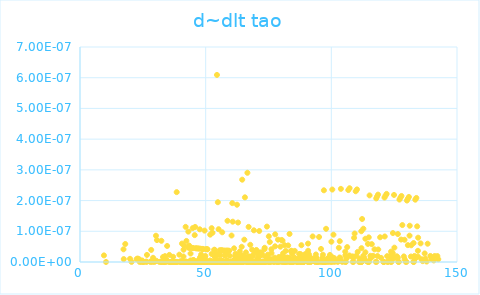
| Category | dlt tao |
|---|---|
| 9.53178891919036 | 0 |
| 10.3467386165883 | 0 |
| 17.3105459186012 | 0 |
| 17.4199598162568 | 0 |
| 18.0070819401701 | 0 |
| 19.9036428826484 | 0 |
| 20.5147507905897 | 0 |
| 22.5134404301075 | 0 |
| 22.9053487203317 | 0 |
| 23.49797863647 | 0 |
| 23.7351005896331 | 0 |
| 24.3033948245919 | 0 |
| 24.7437870989871 | 0 |
| 24.8083655245564 | 0 |
| 25.218148227021 | 0 |
| 25.3012845523701 | 0 |
| 26.3961171387005 | 0 |
| 26.4434301859649 | 0 |
| 26.6449807656151 | 0 |
| 27.9384144145655 | 0 |
| 28.2144466541522 | 0 |
| 28.3311665838172 | 0 |
| 28.8106751048982 | 0 |
| 29.0732695099812 | 0 |
| 29.6623498731978 | 0 |
| 30.221763681162 | 0 |
| 30.4114287727492 | 0 |
| 30.6260510023738 | 0 |
| 31.5777611619317 | 0 |
| 32.2405800195964 | 0 |
| 32.3829430410517 | 0 |
| 32.3937493970673 | 0 |
| 32.6612155315751 | 0 |
| 33.034148997666 | 0 |
| 33.3474886610671 | 0 |
| 33.4731982338109 | 0 |
| 33.651968738842 | 0 |
| 33.8031803237506 | 0 |
| 34.1387609616987 | 0 |
| 34.2834508181426 | 0 |
| 34.4971737972838 | 0 |
| 34.6692226621827 | 0 |
| 35.4493300359824 | 0 |
| 35.5324499577499 | 0 |
| 35.8574260091268 | 0 |
| 35.8699735154628 | 0 |
| 36.4986986069367 | 0 |
| 36.8232942578472 | 0 |
| 36.907384085031 | 0 |
| 37.057455390245 | 0 |
| 37.4173088289364 | 0 |
| 38.0099329123323 | 0 |
| 38.1713898096467 | 0 |
| 38.3830040512725 | 0 |
| 38.4727825871745 | 0 |
| 38.8259578117527 | 0 |
| 39.5291664470679 | 0 |
| 39.8516624496394 | 0 |
| 40.0731206671005 | 0 |
| 40.1067949355218 | 0 |
| 40.4197352786977 | 0 |
| 40.575300368574 | 0 |
| 40.5814612846802 | 0 |
| 40.9579662581042 | 0 |
| 40.976273622671 | 0 |
| 41.0713403725761 | 0 |
| 41.1807600706932 | 0 |
| 41.208676270902 | 0 |
| 41.2898898036796 | 0 |
| 41.4373623677956 | 0 |
| 41.8348538900281 | 0 |
| 41.9744565182207 | 0 |
| 42.0411108321367 | 0 |
| 42.0696446383851 | 0 |
| 42.3291270876214 | 0 |
| 42.4682822821927 | 0 |
| 42.5846803439923 | 0 |
| 43.0018022878112 | 0 |
| 43.0540938819992 | 0 |
| 43.0912404091597 | 0 |
| 43.1051621038595 | 0 |
| 43.2140602119264 | 0 |
| 43.4103098353375 | 0 |
| 43.475912871382 | 0 |
| 43.5287835805229 | 0 |
| 43.6308950171779 | 0 |
| 43.7281945659777 | 0 |
| 43.9676585685433 | 0 |
| 43.9869867119811 | 0 |
| 44.0256175425172 | 0 |
| 44.0619450319661 | 0 |
| 44.0619450319661 | 0 |
| 44.2758963771486 | 0 |
| 44.4393406791775 | 0 |
| 44.654842962438 | 0 |
| 44.6671579574971 | 0 |
| 44.6671579574972 | 0 |
| 44.8157896282103 | 0 |
| 44.8414428849028 | 0 |
| 45.1115838782014 | 0 |
| 45.1226661446329 | 0 |
| 45.1226661446329 | 0 |
| 45.3382289023292 | 0 |
| 45.5955589942705 | 0 |
| 45.6437838045883 | 0 |
| 45.7269614122784 | 0 |
| 45.8045303436243 | 0 |
| 45.9396887233686 | 0 |
| 45.9494831309341 | 0 |
| 46.0701096156716 | 0 |
| 46.1275947779634 | 0 |
| 46.2866611455179 | 0 |
| 46.3837794924045 | 0 |
| 46.4139526435748 | 0 |
| 46.5430445931505 | 0 |
| 46.9335168083535 | 0 |
| 47.1344353949424 | 0 |
| 47.1662485258262 | 0 |
| 47.3123134078223 | 0 |
| 47.3123134078223 | 0 |
| 47.3988923921224 | 0 |
| 47.5568607037933 | 0 |
| 47.6545380840062 | 0 |
| 47.6660780849442 | 0 |
| 47.7425910482454 | 0 |
| 47.9202984130942 | 0 |
| 48.1897810744145 | 0 |
| 48.2022302388593 | 0 |
| 48.2354123025812 | 0 |
| 48.2675356735767 | 0 |
| 48.6688298605997 | 0 |
| 48.8257616428049 | 0 |
| 48.8779602684073 | 0 |
| 48.8851204355681 | 0 |
| 48.9893355741839 | 0 |
| 49.047476999332 | 0 |
| 49.1330336942469 | 0 |
| 49.2702242738959 | 0 |
| 49.5010605946984 | 0 |
| 49.5737329641414 | 0 |
| 49.5939008346793 | 0 |
| 49.6281674052146 | 0 |
| 49.6785164834861 | 0 |
| 49.8202268160232 | 0 |
| 49.8743922268733 | 0 |
| 49.9975499399721 | 0 |
| 50.0095490881492 | 0 |
| 50.2618642710356 | 0 |
| 50.5109394092013 | 0 |
| 50.5475518695021 | 0 |
| 50.580183866807 | 0 |
| 50.7075438174637 | 0 |
| 50.7509113218669 | 0 |
| 51.546629375741 | 0 |
| 51.7238339646241 | 0 |
| 51.7962836504705 | 0 |
| 51.8368112445201 | 0 |
| 51.9957209777882 | 0 |
| 52.2403579620201 | 0 |
| 52.3827738860782 | 0 |
| 52.3885006466114 | 0 |
| 52.423801846108 | 0 |
| 52.5381290112239 | 0 |
| 52.5409840029667 | 0 |
| 52.7195883898955 | 0 |
| 52.8985349513576 | 0 |
| 52.8994801486744 | 0 |
| 53.0184401882968 | 0 |
| 53.1794603206915 | 0 |
| 53.3727926944056 | 0 |
| 53.5999533581887 | 0 |
| 53.6819802168288 | 0 |
| 53.7545812001173 | 0 |
| 53.7545812001173 | 0 |
| 53.7741108713105 | 0 |
| 54.0162475557123 | 0 |
| 54.0486355054408 | 0 |
| 54.0939460568371 | 0 |
| 54.4780230918854 | 0 |
| 54.4963760263011 | 0 |
| 54.4963760263011 | 0 |
| 54.6841384681152 | 0 |
| 54.7608893280597 | 0 |
| 54.7937496435497 | 0 |
| 54.8502962617341 | 0 |
| 55.1475747426848 | 0 |
| 55.4576865727376 | 0 |
| 55.6296234033631 | 0 |
| 55.7409633931815 | 0 |
| 55.7436543473784 | 0 |
| 55.7857956831307 | 0 |
| 55.7992383460563 | 0 |
| 55.8968245967515 | 0 |
| 55.8968245967515 | 0 |
| 55.9719125990885 | 0 |
| 55.9719125990885 | 0 |
| 56.249044436328 | 0 |
| 56.4646349496745 | 0 |
| 56.5080082820126 | 0 |
| 56.5787504280538 | 0 |
| 56.5787504280538 | 0 |
| 56.6246854295898 | 0 |
| 56.6846981115715 | 0 |
| 56.6846981115715 | 0 |
| 56.936411899592 | 0 |
| 57.1065232701134 | 0 |
| 57.4896077565328 | 0 |
| 57.6736941768082 | 0 |
| 57.7551296423097 | 0 |
| 57.8718843653807 | 0 |
| 57.9357834157785 | 0 |
| 57.9444130179951 | 0 |
| 57.9858172314576 | 0 |
| 58.1820848715479 | 0 |
| 58.2619515636062 | 0 |
| 58.3854005724034 | 0 |
| 58.4957690777718 | 0 |
| 58.5487403792772 | 0 |
| 58.6212845304502 | 0 |
| 58.6741425161033 | 0 |
| 58.6894794660849 | 0 |
| 58.6894794660849 | 0 |
| 58.7099225003747 | 0 |
| 58.7286556971978 | 0 |
| 59.1375937961632 | 0 |
| 59.3426912096174 | 0 |
| 59.5470822123133 | 0 |
| 59.7089189317643 | 0 |
| 59.9320865647109 | 0 |
| 60.1469450595789 | 0 |
| 60.1569198014659 | 0 |
| 60.3013681436831 | 0 |
| 60.5892317165353 | 0 |
| 60.7762700402057 | 0 |
| 60.7762700402057 | 0 |
| 60.8412277982619 | 0 |
| 60.8749127309436 | 0 |
| 60.9397653425085 | 0 |
| 61.2074750336918 | 0 |
| 61.2687114276121 | 0 |
| 61.3054239035993 | 0 |
| 61.3078706203372 | 0 |
| 61.32010273964 | 0 |
| 61.7175420767872 | 0 |
| 61.7507489833119 | 0 |
| 61.8340925380166 | 0 |
| 61.8947089822709 | 0 |
| 62.1365834271567 | 0 |
| 62.3679003975603 | 0 |
| 62.3751152303545 | 0 |
| 62.4207898059613 | 0 |
| 62.4207898059613 | 0 |
| 62.4640296490708 | 0 |
| 62.8892280124347 | 0 |
| 62.9329405001864 | 0 |
| 63.0139270320459 | 0 |
| 63.1542160112846 | 0 |
| 63.5700794399378 | 0 |
| 63.5897397384201 | 0 |
| 63.8204904399833 | 0 |
| 63.8980046636826 | 0 |
| 64.07148351646 | 0 |
| 64.1042510290854 | 0 |
| 64.1650605859607 | 0 |
| 64.2468287155094 | 0 |
| 64.3401507614025 | 0 |
| 64.3401507614025 | 0 |
| 64.3494755223382 | 0 |
| 64.391420235929 | 0 |
| 64.5325886665025 | 0 |
| 64.5728658183916 | 0 |
| 64.5821569785339 | 0 |
| 64.6935468188288 | 0 |
| 64.751486469424 | 0 |
| 64.7538029771225 | 0 |
| 64.7538029771225 | 0 |
| 64.8810835297932 | 0 |
| 64.9796506608031 | 0 |
| 64.9981153572932 | 0 |
| 65.0995775715941 | 0 |
| 65.1141689649803 | 0 |
| 65.3785515287698 | 0 |
| 65.4679692674212 | 0 |
| 65.6182520340187 | 0 |
| 66.0223825683381 | 0 |
| 66.2763532491039 | 0 |
| 66.3396939998972 | 0 |
| 66.4112565759751 | 0 |
| 66.5428809114844 | 0 |
| 66.6059682010554 | 0 |
| 66.6059682010554 | 0 |
| 66.6194791333586 | 0 |
| 66.8599655997519 | 0 |
| 67.0943738326844 | 0 |
| 67.1390720817618 | 0 |
| 67.139816800465 | 0 |
| 67.3175682864436 | 0 |
| 67.5518689600813 | 0 |
| 67.7469925531754 | 0 |
| 67.8060100581062 | 0 |
| 67.9658370065432 | 0 |
| 68.134829566089 | 0 |
| 68.3743738545371 | 0 |
| 68.5000364963406 | 0 |
| 68.5394411999398 | 0 |
| 68.9278971099511 | 0 |
| 68.9344253620787 | 0 |
| 68.9453044086398 | 0 |
| 69.1184128868712 | 0 |
| 69.1878240733151 | 0 |
| 69.5187384810743 | 0 |
| 69.5733785294347 | 0 |
| 69.5992456855676 | 0 |
| 69.8251745432835 | 0 |
| 70.1637727035826 | 0 |
| 70.4177179408706 | 0 |
| 70.4709514622869 | 0 |
| 70.5028722819149 | 0 |
| 70.7930434435475 | 0 |
| 70.8106983442474 | 0 |
| 71.017990678419 | 0 |
| 71.1502283903573 | 0 |
| 71.3004558190199 | 0 |
| 71.3004558190199 | 0 |
| 71.3039620217559 | 0 |
| 71.3214904499338 | 0 |
| 71.5140196045503 | 0 |
| 71.9955206939987 | 0 |
| 72.0496703670461 | 0 |
| 72.0788110334792 | 0 |
| 72.1820961180818 | 0 |
| 72.6240662590577 | 0 |
| 72.6240662590577 | 0 |
| 72.7932345757489 | 0 |
| 73.0749957235716 | 0 |
| 73.1098830528404 | 0 |
| 73.3999659400466 | 0 |
| 73.481664379626 | 0 |
| 73.6617607717871 | 0 |
| 73.7187560936835 | 0 |
| 73.7431691751853 | 0 |
| 73.9435933668361 | 0 |
| 74.3744243675203 | 0 |
| 74.7492809329963 | 0 |
| 74.7633265712542 | 0 |
| 75.0076996047739 | 0 |
| 75.0090327893915 | 0 |
| 75.1235981566379 | 0 |
| 75.4105761813288 | 0 |
| 75.470225917245 | 0 |
| 75.5172496850885 | 0 |
| 75.6786297444662 | 0 |
| 75.7156192604934 | 0 |
| 75.7638106222225 | 0 |
| 76.1587486766951 | 0 |
| 76.2060037004959 | 0 |
| 76.9600870581628 | 0 |
| 77.2984799333079 | 0 |
| 77.412886524144 | 0 |
| 77.6154301669455 | 0 |
| 77.6585796934248 | 0 |
| 77.7833851153317 | 0 |
| 77.8951538929092 | 0 |
| 78.3106314621457 | 0 |
| 78.7061306379624 | 0 |
| 78.7366179106012 | 0 |
| 78.7747104088616 | 0 |
| 79.0199658314277 | 0 |
| 79.198200737138 | 0 |
| 79.2095638164988 | 0 |
| 79.7336503616886 | 0 |
| 79.9221809011741 | 0 |
| 80.1002808983839 | 0 |
| 80.2256505115415 | 0 |
| 80.345223877963 | 0 |
| 80.5701867938756 | 0 |
| 80.789572346931 | 0 |
| 80.9682345120604 | 0 |
| 81.1643702618335 | 0 |
| 81.2401070900328 | 0 |
| 81.2585687789294 | 0 |
| 81.4171664945422 | 0 |
| 81.5073923027844 | 0 |
| 81.5202735520435 | 0 |
| 81.7114129115389 | 0 |
| 81.8337033257081 | 0 |
| 82.0484917594468 | 0 |
| 82.4108912705111 | 0 |
| 82.821826833269 | 0 |
| 82.8290709835623 | 0 |
| 83.1922772858154 | 0 |
| 83.3717877941933 | 0 |
| 83.6489987985511 | 0 |
| 83.8048626274156 | 0 |
| 83.8495974945617 | 0 |
| 83.9526950133228 | 0 |
| 84.0836190943278 | 0 |
| 84.4284016193603 | 0 |
| 84.4947039760481 | 0 |
| 84.5035798058284 | 0 |
| 84.6879861609662 | 0 |
| 84.9514861553346 | 0 |
| 85.277517552987 | 0 |
| 85.4444556422475 | 0 |
| 86.1821037106893 | 0 |
| 86.2325634548806 | 0 |
| 86.3507672229958 | 0 |
| 86.39765621821 | 0 |
| 86.7718560363901 | 0 |
| 86.9635268374047 | 0 |
| 87.209259829447 | 0 |
| 87.4159882401383 | 0 |
| 87.4880277523731 | 0 |
| 87.6661565257654 | 0 |
| 87.7476780319571 | 0 |
| 87.9207313436371 | 0 |
| 88.0911743592966 | 0 |
| 88.4175039231486 | 0 |
| 88.6530033332205 | 0 |
| 88.982329706521 | 0 |
| 89.0160378808224 | 0 |
| 89.0716284795557 | 0 |
| 89.1103529338763 | 0 |
| 89.5396839395807 | 0 |
| 89.6038782642805 | 0 |
| 90.0041943467081 | 0 |
| 90.6457665862008 | 0 |
| 90.7246107734831 | 0 |
| 90.7598754957278 | 0 |
| 90.8919963473132 | 0 |
| 91.0826822178618 | 0 |
| 91.1079305000394 | 0 |
| 91.657814724114 | 0 |
| 91.8098850886984 | 0 |
| 91.821321053446 | 0 |
| 91.8376556756541 | 0 |
| 92.5740514399149 | 0 |
| 93.4486757530571 | 0 |
| 93.5946312562852 | 0 |
| 93.626678890154 | 0 |
| 93.8581642692845 | 0 |
| 94.1140531482945 | 0 |
| 94.3210209868405 | 0 |
| 94.5640259295257 | 0 |
| 95.1170594583327 | 0 |
| 95.2609836186883 | 0 |
| 95.8882422406418 | 0 |
| 96.1106393694267 | 0 |
| 96.4300523695803 | 0 |
| 96.6087728935628 | 0 |
| 96.6470641044 | 0 |
| 96.8398420073061 | 0 |
| 97.0038916745097 | 0 |
| 97.0451183728476 | 0 |
| 97.3327026235273 | 0 |
| 97.5774307921663 | 0 |
| 97.7341035667694 | 0 |
| 97.9038048290259 | 0 |
| 98.2891397866519 | 0 |
| 98.6537125505168 | 0 |
| 98.782867947838 | 0 |
| 99.4482528755533 | 0 |
| 99.5919424451597 | 0 |
| 100.01527383355 | 0 |
| 100.235996528193 | 0 |
| 100.388022193885 | 0 |
| 100.514949136932 | 0 |
| 100.84867376421 | 0 |
| 101.169931303723 | 0 |
| 101.221810890736 | 0 |
| 102.576093706087 | 0 |
| 102.793749809996 | 0 |
| 102.987159393781 | 0 |
| 103.29837849647 | 0 |
| 103.349189643654 | 0 |
| 103.588874885289 | 0 |
| 103.79670033291 | 0 |
| 104.370757398804 | 0 |
| 105.529403485474 | 0 |
| 105.561143419347 | 0 |
| 105.5990293516 | 0 |
| 105.772657147299 | 0 |
| 106.037516945655 | 0 |
| 106.093614322446 | 0 |
| 106.312534538501 | 0 |
| 106.747622924354 | 0 |
| 107.178146093315 | 0 |
| 107.264882417313 | 0 |
| 108.183894365104 | 0 |
| 108.51384704267 | 0 |
| 108.54701746248 | 0 |
| 108.752724103813 | 0 |
| 108.899747474455 | 0 |
| 109.058493479417 | 0 |
| 109.27787973785 | 0 |
| 109.701207832913 | 0 |
| 109.95660507673 | 0 |
| 110.204605166935 | 0 |
| 110.491877529527 | 0 |
| 111.016012358578 | 0 |
| 111.240977162195 | 0 |
| 111.533649630952 | 0 |
| 111.733857894552 | 0 |
| 111.911817963967 | 0 |
| 111.987298386915 | 0 |
| 112.014083935905 | 0 |
| 112.024796362234 | 0 |
| 112.245066706738 | 0 |
| 112.743758142081 | 0 |
| 112.746419011869 | 0 |
| 113.109482361118 | 0 |
| 113.542304891173 | 0 |
| 113.54450669231 | 0 |
| 113.846629286949 | 0 |
| 114.520980610541 | 0 |
| 114.570742338522 | 0 |
| 114.715975347813 | 0 |
| 114.889316300516 | 0 |
| 114.988934250214 | 0 |
| 115.213953148045 | 0 |
| 115.546765424221 | 0 |
| 115.745647866345 | 0 |
| 116.091149533459 | 0 |
| 116.620559936917 | 0 |
| 117.174037226683 | 0 |
| 117.699001695002 | 0 |
| 117.867955781035 | 0 |
| 117.965058385947 | 0 |
| 118.184410985544 | 0 |
| 118.356896714978 | 0 |
| 118.575946127366 | 0 |
| 118.661093033901 | 0 |
| 119.405422824929 | 0 |
| 119.795888911097 | 0 |
| 120.682869538307 | 0 |
| 120.942362305356 | 0 |
| 120.952283980089 | 0 |
| 121.156324638873 | 0 |
| 121.250793811835 | 0 |
| 121.538286148851 | 0 |
| 121.992848151029 | 0 |
| 122.200470539192 | 0 |
| 122.435105259889 | 0 |
| 122.475528167875 | 0 |
| 123.289314216602 | 0 |
| 123.667517966522 | 0 |
| 123.753606008068 | 0 |
| 123.859012590929 | 0 |
| 123.920760972486 | 0 |
| 124.129589542542 | 0 |
| 124.440969941575 | 0 |
| 124.502429695167 | 0 |
| 124.946208425866 | 0 |
| 125.005019899202 | 0 |
| 125.090587175854 | 0 |
| 126.069643451546 | 0 |
| 126.452580044853 | 0 |
| 126.484603806155 | 0 |
| 126.652891794858 | 0 |
| 126.900177304841 | 0 |
| 127.104110869791 | 0 |
| 127.468250949011 | 0 |
| 127.76132043776 | 0 |
| 127.901739628513 | 0 |
| 128.246072064606 | 0 |
| 128.859826943854 | 0 |
| 129.126507735631 | 0 |
| 129.164836546175 | 0 |
| 129.638940908972 | 0 |
| 129.880541267736 | 0 |
| 130.079802429124 | 0 |
| 130.435635468226 | 0 |
| 130.446368289807 | 0 |
| 130.859294664154 | 0 |
| 131.123815533259 | 0 |
| 131.195865026303 | 0 |
| 131.659238187071 | 0 |
| 131.78374330698 | 0 |
| 132.62561969695 | 0 |
| 132.738295152529 | 0 |
| 132.861789089264 | 0 |
| 133.056585706984 | 0 |
| 133.144864715091 | 0 |
| 133.404478935304 | 0 |
| 133.461061737122 | 0 |
| 133.81873934543 | 0 |
| 134.147884813738 | 0 |
| 134.455401527793 | 0 |
| 134.467300857867 | 0 |
| 134.53198504445 | 0 |
| 135.524001564299 | 0 |
| 135.856008332352 | 0 |
| 136.364053181181 | 0 |
| 137.140639490998 | 0 |
| 137.412353884212 | 0 |
| 137.932429109329 | 0 |
| 138.318671913809 | 0 |
| 139.410742053832 | 0 |
| 139.83867490791 | 0 |
| 140.743223637943 | 0 |
| 141.121773656654 | 0 |
| 142.192316951374 | 0 |
| 142.548781124217 | 0 |